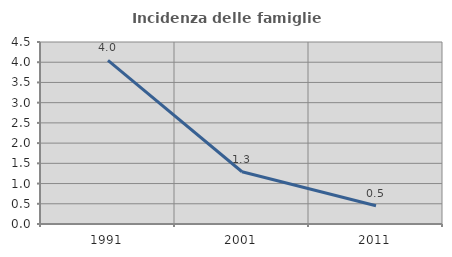
| Category | Incidenza delle famiglie numerose |
|---|---|
| 1991.0 | 4.046 |
| 2001.0 | 1.292 |
| 2011.0 | 0.451 |